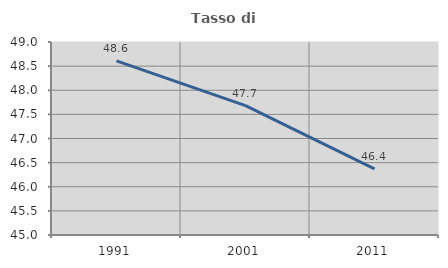
| Category | Tasso di occupazione   |
|---|---|
| 1991.0 | 48.61 |
| 2001.0 | 47.681 |
| 2011.0 | 46.371 |